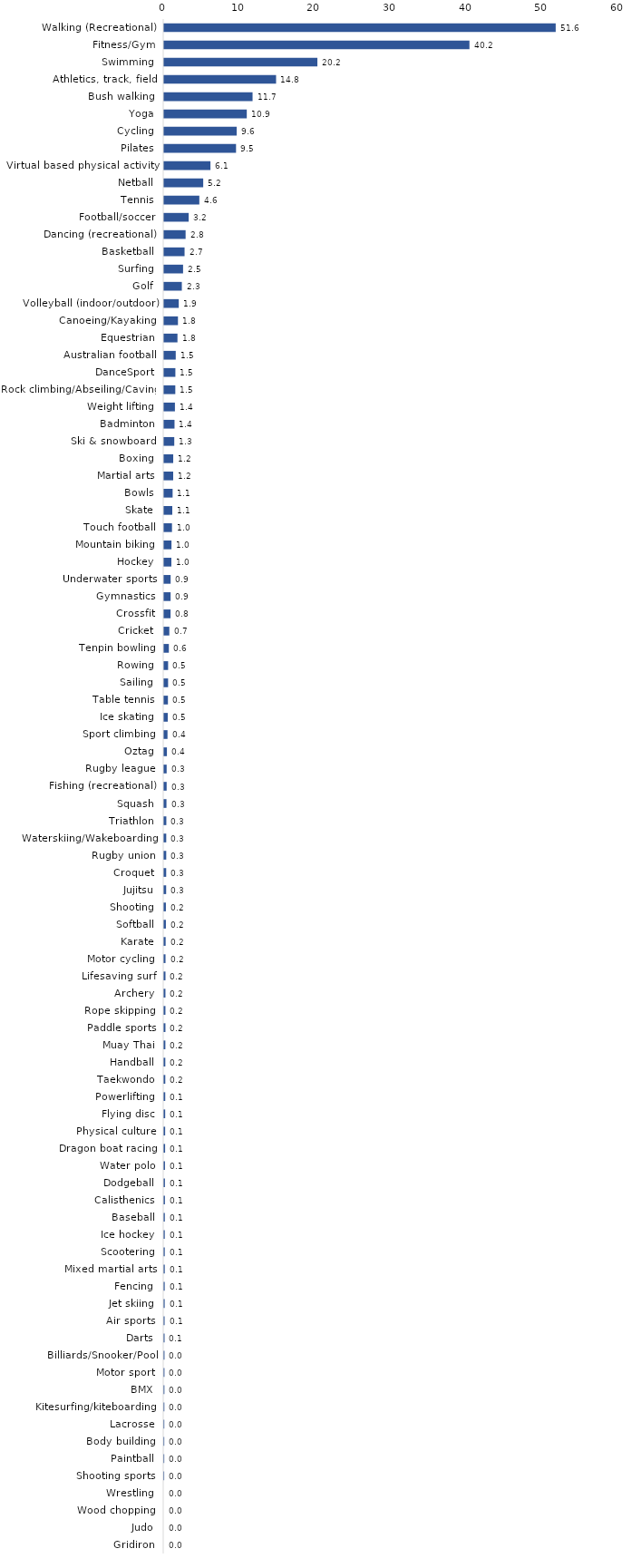
| Category | Series 0 |
|---|---|
| Walking (Recreational) | 51.616 |
| Fitness/Gym | 40.246 |
| Swimming | 20.202 |
| Athletics, track, field | 14.758 |
| Bush walking | 11.658 |
| Yoga | 10.896 |
| Cycling | 9.564 |
| Pilates | 9.479 |
| Virtual based physical activity | 6.107 |
| Netball | 5.153 |
| Tennis | 4.64 |
| Football/soccer | 3.236 |
| Dancing (recreational) | 2.832 |
| Basketball | 2.695 |
| Surfing | 2.498 |
| Golf | 2.335 |
| Volleyball (indoor/outdoor) | 1.928 |
| Canoeing/Kayaking | 1.824 |
| Equestrian | 1.759 |
| Australian football | 1.531 |
| DanceSport | 1.484 |
| Rock climbing/Abseiling/Caving | 1.474 |
| Weight lifting | 1.424 |
| Badminton | 1.371 |
| Ski & snowboard | 1.337 |
| Boxing | 1.2 |
| Martial arts | 1.194 |
| Bowls | 1.12 |
| Skate | 1.073 |
| Touch football | 1.036 |
| Mountain biking | 0.97 |
| Hockey | 0.958 |
| Underwater sports | 0.858 |
| Gymnastics | 0.855 |
| Crossfit | 0.85 |
| Cricket | 0.687 |
| Tenpin bowling | 0.624 |
| Rowing | 0.526 |
| Sailing | 0.524 |
| Table tennis | 0.502 |
| Ice skating | 0.478 |
| Sport climbing | 0.445 |
| Oztag | 0.368 |
| Rugby league | 0.334 |
| Fishing (recreational) | 0.333 |
| Squash | 0.308 |
| Triathlon | 0.291 |
| Waterskiing/Wakeboarding | 0.279 |
| Rugby union | 0.278 |
| Croquet | 0.272 |
| Jujitsu | 0.268 |
| Shooting | 0.233 |
| Softball | 0.233 |
| Karate | 0.199 |
| Motor cycling | 0.183 |
| Lifesaving surf | 0.179 |
| Archery | 0.174 |
| Rope skipping | 0.172 |
| Paddle sports | 0.172 |
| Muay Thai | 0.163 |
| Handball | 0.157 |
| Taekwondo | 0.155 |
| Powerlifting | 0.147 |
| Flying disc | 0.14 |
| Physical culture | 0.136 |
| Dragon boat racing | 0.13 |
| Water polo | 0.113 |
| Dodgeball | 0.107 |
| Calisthenics | 0.106 |
| Baseball | 0.094 |
| Ice hockey | 0.086 |
| Scootering | 0.085 |
| Mixed martial arts | 0.085 |
| Fencing | 0.077 |
| Jet skiing | 0.073 |
| Air sports | 0.063 |
| Darts | 0.059 |
| Billiards/Snooker/Pool | 0.05 |
| Motor sport | 0.044 |
| BMX | 0.038 |
| Kitesurfing/kiteboarding | 0.032 |
| Lacrosse | 0.023 |
| Body building | 0.019 |
| Paintball | 0.017 |
| Shooting sports | 0.011 |
| Wrestling | 0 |
| Wood chopping | 0 |
| Judo | 0 |
| Gridiron | 0 |